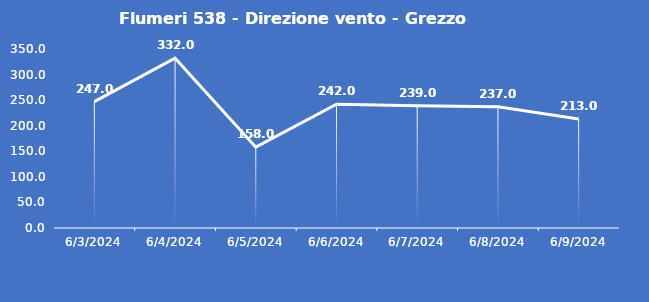
| Category | Flumeri 538 - Direzione vento - Grezzo (°N) |
|---|---|
| 6/3/24 | 247 |
| 6/4/24 | 332 |
| 6/5/24 | 158 |
| 6/6/24 | 242 |
| 6/7/24 | 239 |
| 6/8/24 | 237 |
| 6/9/24 | 213 |